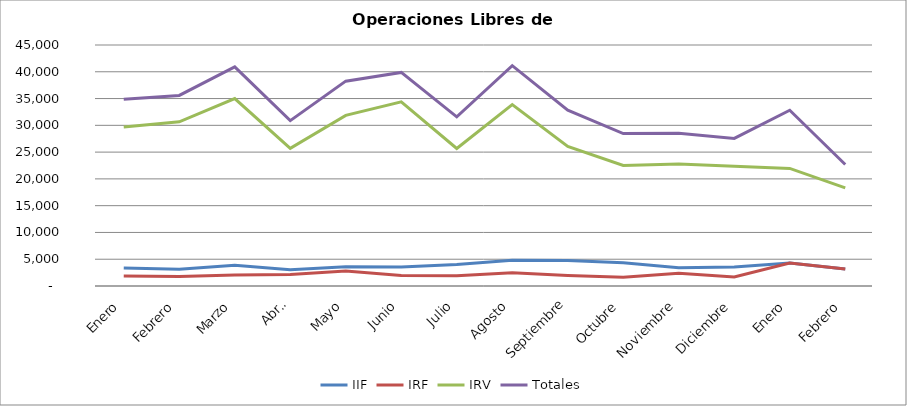
| Category | IIF | IRF | IRV | Totales |
|---|---|---|---|---|
| Enero | 3342 | 1859 | 29681 | 34882 |
| Febrero | 3138 | 1795 | 30647 | 35580 |
| Marzo | 3870 | 2039 | 34994 | 40903 |
| Abril | 3022.5 | 2155 | 25706 | 30883.5 |
| Mayo | 3586 | 2801 | 31864 | 38251 |
| Junio | 3545.5 | 1958 | 34378 | 39881.5 |
| Julio | 4011.5 | 1897 | 25683 | 31591.5 |
| Agosto | 4813 | 2457 | 33871 | 41141 |
| Septiembre | 4784.5 | 1980.5 | 26077 | 32842 |
| Octubre | 4358.5 | 1614 | 22499 | 28471.5 |
| Noviembre | 3403 | 2370.5 | 22770 | 28543.5 |
| Diciembre | 3536.5 | 1677 | 22351 | 27564.5 |
| Enero | 4289.5 | 4289.5 | 21960 | 32816.5 |
| Febrero | 3193.5 | 3193.5 | 18310 | 22678.5 |